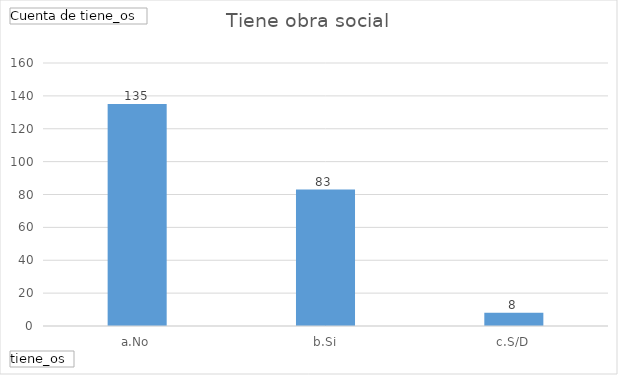
| Category | Total |
|---|---|
| a.No | 135 |
| b.Si | 83 |
| c.S/D | 8 |